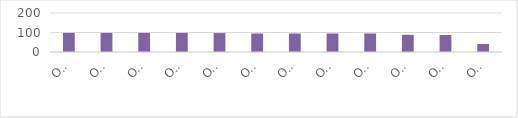
| Category | Series 0 |
|---|---|
| ОГБОУ СПО Ульяновский техникум железнодорожного транспорта | 98 |
| ОГБОУ СПО Ульяновский социально-педагогический колледж №1 | 98 |
| ОГБОУ СПО "Ульяновский строительный колледж" | 98 |
| ОГБОУ СПО «Ульяновский электромеханический колледж» | 98 |
| ОГБОУ СПО технологический техникум в р.п.Радищево | 97 |
| ОГБОУ СПОтехнологический техникум в р.п. Николаевка  | 95 |
| ОГБОУ СПО «Димитровградский техникум строительной индустрии» | 95 |
| ОГБОУ СПО «Димитровградский техникум профессиональных технологий имени Героя Советского Союза М.С.Чернова» | 95 |
| ОГБОУ СПО " Сурский агротехнологический техникум "  | 95 |
| ОГБОУ СПО технологический техникум р.п.Павловка | 88 |
| ОГБОУ СПО «Карсунский медицинский техникум» | 87 |
| ОГБОУ СПО «Димитровградский механико-технологический колледж молочной промышленности» | 41 |